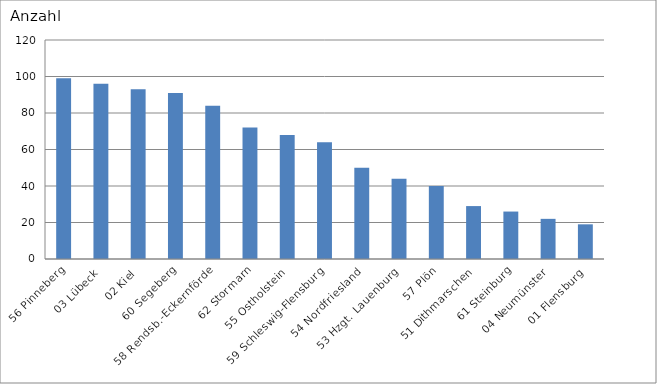
| Category | 56 Pinneberg 03 Lübeck 02 Kiel 60 Segeberg 58 Rendsb.-Eckernförde 62 Stormarn 55 Ostholstein 59 Schleswig-Flensburg 54 Nordfriesland 53 Hzgt. Lauenburg 57 Plön 51 Dithmarschen 61 Steinburg 04 Neumünster 01 Flensburg |
|---|---|
| 56 Pinneberg | 99 |
| 03 Lübeck | 96 |
| 02 Kiel | 93 |
| 60 Segeberg | 91 |
| 58 Rendsb.-Eckernförde | 84 |
| 62 Stormarn | 72 |
| 55 Ostholstein | 68 |
| 59 Schleswig-Flensburg | 64 |
| 54 Nordfriesland | 50 |
| 53 Hzgt. Lauenburg | 44 |
| 57 Plön | 40 |
| 51 Dithmarschen | 29 |
| 61 Steinburg | 26 |
| 04 Neumünster | 22 |
| 01 Flensburg | 19 |